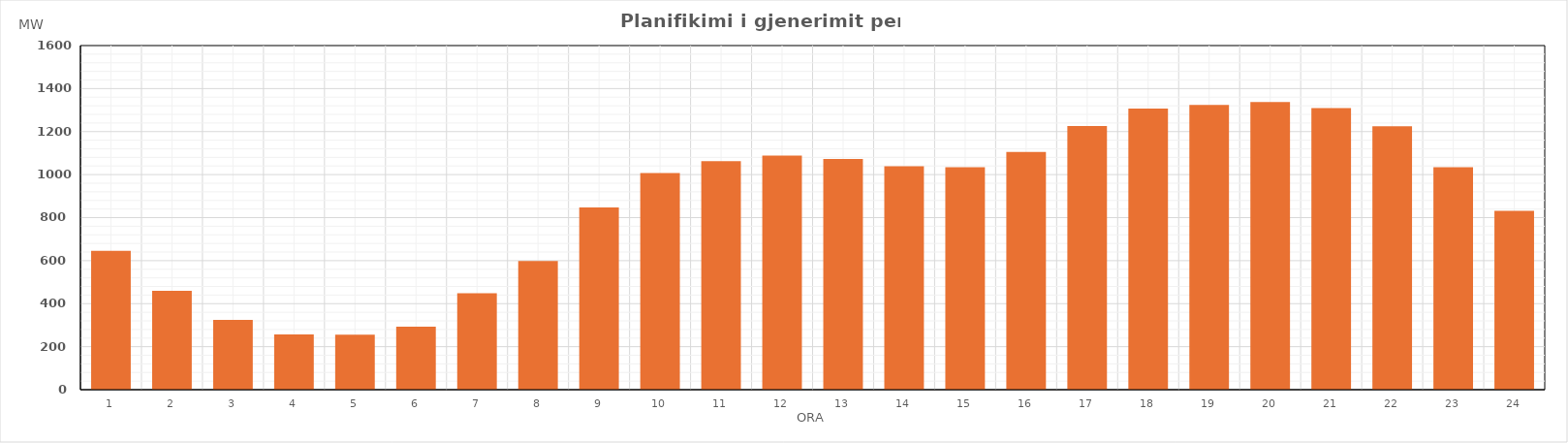
| Category | Max (MW) |
|---|---|
| 0 | 645.09 |
| 1 | 459.94 |
| 2 | 324.92 |
| 3 | 256.94 |
| 4 | 255.91 |
| 5 | 293.51 |
| 6 | 447.94 |
| 7 | 597.91 |
| 8 | 846.95 |
| 9 | 1007.01 |
| 10 | 1062.9 |
| 11 | 1088.37 |
| 12 | 1072.96 |
| 13 | 1038.76 |
| 14 | 1034.21 |
| 15 | 1105.14 |
| 16 | 1225.74 |
| 17 | 1307.1 |
| 18 | 1324.3 |
| 19 | 1337.26 |
| 20 | 1309.27 |
| 21 | 1225.17 |
| 22 | 1034.69 |
| 23 | 831.79 |